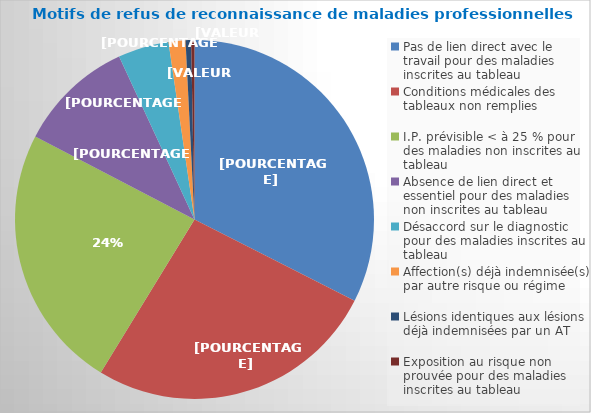
| Category | Fréquence |
|---|---|
| Pas de lien direct avec le travail pour des maladies inscrites au tableau | 0.324 |
| Conditions médicales des tableaux non remplies  | 0.263 |
| I.P. prévisible < à 25 % pour des maladies non inscrites au tableau | 0.239 |
| Absence de lien direct et essentiel pour des maladies non inscrites au tableau | 0.105 |
| Désaccord sur le diagnostic pour des maladies inscrites au tableau | 0.046 |
| Affection(s) déjà indemnisée(s) par autre risque ou régime | 0.015 |
| Lésions identiques aux lésions déjà indemnisées par un AT | 0.005 |
| Exposition au risque non prouvée pour des maladies inscrites au tableau | 0.003 |